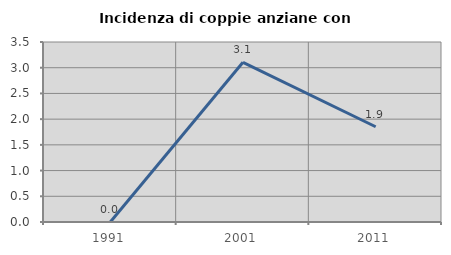
| Category | Incidenza di coppie anziane con figli |
|---|---|
| 1991.0 | 0 |
| 2001.0 | 3.106 |
| 2011.0 | 1.852 |